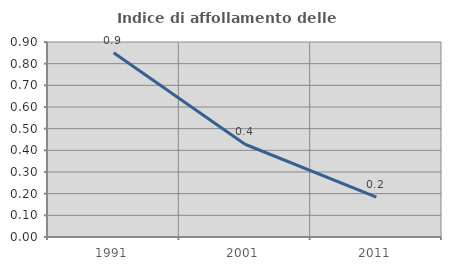
| Category | Indice di affollamento delle abitazioni  |
|---|---|
| 1991.0 | 0.85 |
| 2001.0 | 0.428 |
| 2011.0 | 0.184 |